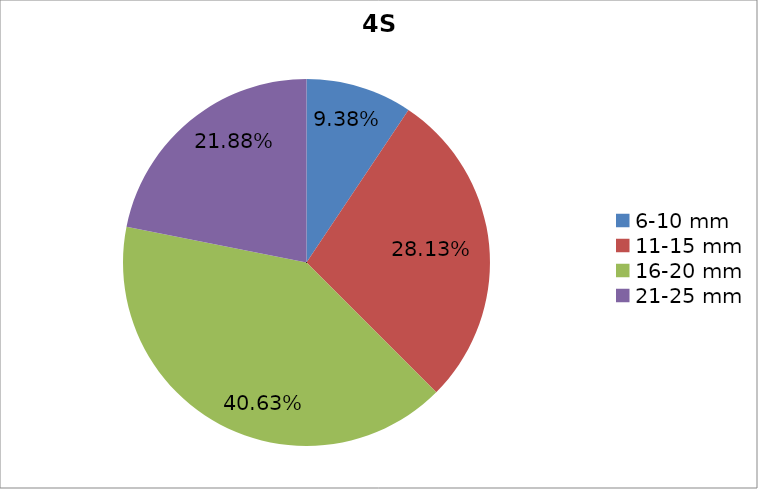
| Category | Series 0 |
|---|---|
| 6-10 mm | 0.094 |
| 11-15 mm | 0.281 |
| 16-20 mm | 0.406 |
| 21-25 mm | 0.219 |